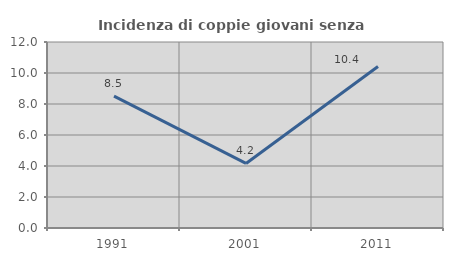
| Category | Incidenza di coppie giovani senza figli |
|---|---|
| 1991.0 | 8.511 |
| 2001.0 | 4.167 |
| 2011.0 | 10.417 |